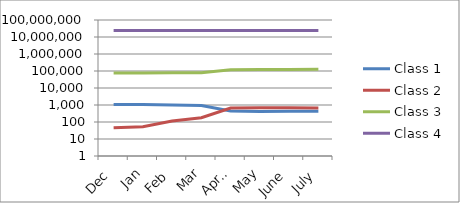
| Category | Class 1 | Class 2 | Class 3 | Class 4 |
|---|---|---|---|---|
| Dec | 1078 | 46 | 75711 | 23957573 |
| Jan | 1067 | 53 | 76685 | 23972323 |
| Feb | 990 | 115 | 78345 | 23986004 |
| Mar | 930 | 179 | 80084 | 23996449 |
| April | 449 | 663 | 119857 | 23975239 |
| May | 420 | 686 | 121241 | 23988139 |
| June | 422 | 687 | 123483 | 24005430 |
| July | 425 | 668 | 125650 | 24022437 |